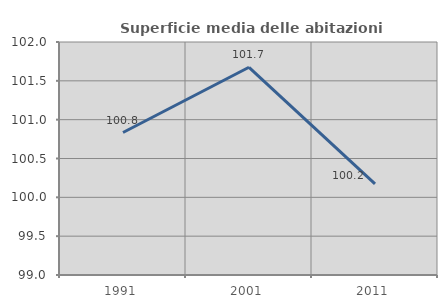
| Category | Superficie media delle abitazioni occupate |
|---|---|
| 1991.0 | 100.835 |
| 2001.0 | 101.675 |
| 2011.0 | 100.174 |